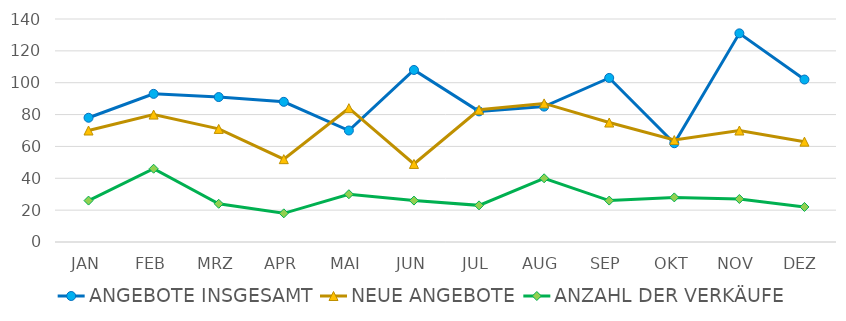
| Category | ANGEBOTE INSGESAMT | NEUE ANGEBOTE | ANZAHL DER VERKÄUFE |
|---|---|---|---|
| JAN | 78 | 70 | 26 |
| FEB | 93 | 80 | 46 |
| MRZ | 91 | 71 | 24 |
| APR | 88 | 52 | 18 |
| MAI | 70 | 84 | 30 |
| JUN | 108 | 49 | 26 |
| JUL | 82 | 83 | 23 |
| AUG | 85 | 87 | 40 |
| SEP | 103 | 75 | 26 |
| OKT | 62 | 64 | 28 |
| NOV | 131 | 70 | 27 |
| DEZ | 102 | 63 | 22 |